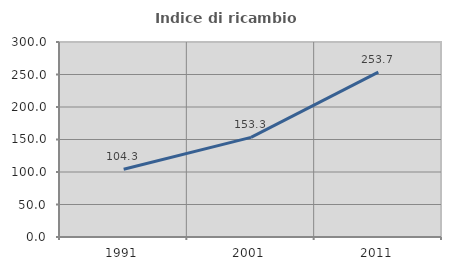
| Category | Indice di ricambio occupazionale  |
|---|---|
| 1991.0 | 104.291 |
| 2001.0 | 153.305 |
| 2011.0 | 253.69 |